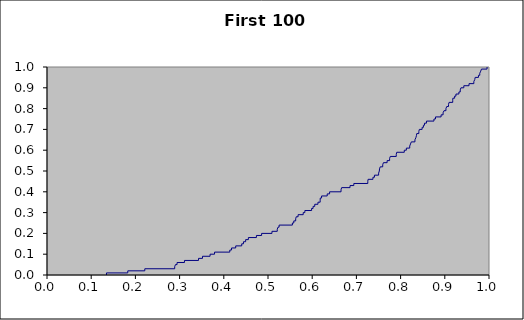
| Category | Series 0 |
|---|---|
| 0.13455305386940608 | 0 |
| 0.13455305386940608 | 0.01 |
| 0.18276183317802958 | 0.01 |
| 0.18276183317802958 | 0.02 |
| 0.22124137839260483 | 0.02 |
| 0.22124137839260483 | 0.03 |
| 0.2889093945239742 | 0.03 |
| 0.2889093945239742 | 0.04 |
| 0.29066765360203234 | 0.04 |
| 0.29066765360203234 | 0.05 |
| 0.29422580143166954 | 0.05 |
| 0.29422580143166954 | 0.06 |
| 0.3109875620651161 | 0.06 |
| 0.3109875620651161 | 0.07 |
| 0.34282517261200224 | 0.07 |
| 0.34282517261200224 | 0.08 |
| 0.3517873820542869 | 0.08 |
| 0.3517873820542869 | 0.09 |
| 0.3689463281720448 | 0.09 |
| 0.3689463281720448 | 0.1 |
| 0.3790477668345028 | 0.1 |
| 0.3790477668345028 | 0.11 |
| 0.41357675492989415 | 0.11 |
| 0.41357675492989415 | 0.12 |
| 0.417493631801864 | 0.12 |
| 0.417493631801864 | 0.13 |
| 0.4269480113402916 | 0.13 |
| 0.4269480113402916 | 0.14 |
| 0.44053109392780376 | 0.14 |
| 0.44053109392780376 | 0.15 |
| 0.4445297881575609 | 0.15 |
| 0.4445297881575609 | 0.16 |
| 0.44939216450777775 | 0.16 |
| 0.44939216450777775 | 0.17 |
| 0.4555851932242986 | 0.17 |
| 0.4555851932242986 | 0.18 |
| 0.47379882273148494 | 0.18 |
| 0.47379882273148494 | 0.19 |
| 0.4855100597031753 | 0.19 |
| 0.4855100597031753 | 0.2 |
| 0.5089497839653756 | 0.2 |
| 0.5089497839653756 | 0.21 |
| 0.5209627517010066 | 0.21 |
| 0.5209627517010066 | 0.22 |
| 0.5226923157140931 | 0.22 |
| 0.5226923157140931 | 0.23 |
| 0.5251040575780742 | 0.23 |
| 0.5251040575780742 | 0.24 |
| 0.5551500112860211 | 0.24 |
| 0.5551500112860211 | 0.25 |
| 0.5583286015876231 | 0.25 |
| 0.5583286015876231 | 0.26 |
| 0.5626280067760266 | 0.26 |
| 0.5626280067760266 | 0.27 |
| 0.5638732604246404 | 0.27 |
| 0.5638732604246404 | 0.28 |
| 0.5680648654399378 | 0.28 |
| 0.5680648654399378 | 0.29 |
| 0.5796776962765396 | 0.29 |
| 0.5796776962765396 | 0.3 |
| 0.5833835432091734 | 0.3 |
| 0.5833835432091734 | 0.31 |
| 0.5986512667009289 | 0.31 |
| 0.5986512667009289 | 0.32 |
| 0.6020101268498207 | 0.32 |
| 0.6020101268498207 | 0.33 |
| 0.6057763103128806 | 0.33 |
| 0.6057763103128806 | 0.34 |
| 0.6129847978524068 | 0.34 |
| 0.6129847978524068 | 0.35 |
| 0.6180251090993006 | 0.35 |
| 0.6180251090993006 | 0.36 |
| 0.6182573211400452 | 0.36 |
| 0.6182573211400452 | 0.37 |
| 0.6212044414760152 | 0.37 |
| 0.6212044414760152 | 0.38 |
| 0.6339704736572748 | 0.38 |
| 0.6339704736572748 | 0.39 |
| 0.639362838360495 | 0.39 |
| 0.639362838360495 | 0.4 |
| 0.6652625014112356 | 0.4 |
| 0.6652625014112356 | 0.41 |
| 0.6666106008838641 | 0.41 |
| 0.6666106008838641 | 0.42 |
| 0.6855616080756904 | 0.42 |
| 0.6855616080756904 | 0.43 |
| 0.6941687461939142 | 0.43 |
| 0.6941687461939142 | 0.44 |
| 0.7257639014780729 | 0.44 |
| 0.7257639014780729 | 0.45 |
| 0.7264253804586218 | 0.45 |
| 0.7264253804586218 | 0.46 |
| 0.7374461408638304 | 0.46 |
| 0.7374461408638304 | 0.47 |
| 0.7408600242821723 | 0.47 |
| 0.7408600242821723 | 0.48 |
| 0.7502604141916246 | 0.48 |
| 0.7502604141916246 | 0.49 |
| 0.7518715577794326 | 0.49 |
| 0.7518715577794326 | 0.5 |
| 0.7523297901009789 | 0.5 |
| 0.7523297901009789 | 0.51 |
| 0.7538860990464556 | 0.51 |
| 0.7538860990464556 | 0.52 |
| 0.7595407718475183 | 0.52 |
| 0.7595407718475183 | 0.53 |
| 0.7611422608573828 | 0.53 |
| 0.7611422608573828 | 0.54 |
| 0.7694822541234644 | 0.54 |
| 0.7694822541234644 | 0.55 |
| 0.7751330488475033 | 0.55 |
| 0.7751330488475033 | 0.56 |
| 0.7766462401101253 | 0.56 |
| 0.7766462401101253 | 0.57 |
| 0.7901772275603912 | 0.57 |
| 0.7901772275603912 | 0.58 |
| 0.7912846154829163 | 0.58 |
| 0.7912846154829163 | 0.59 |
| 0.8083528484278573 | 0.59 |
| 0.8083528484278573 | 0.6 |
| 0.8130650416595592 | 0.6 |
| 0.8130650416595592 | 0.61 |
| 0.8206241466640288 | 0.61 |
| 0.8206241466640288 | 0.62 |
| 0.8223900363704881 | 0.62 |
| 0.8223900363704881 | 0.63 |
| 0.8242858136484837 | 0.63 |
| 0.8242858136484837 | 0.64 |
| 0.8324097034456521 | 0.64 |
| 0.8324097034456521 | 0.65 |
| 0.8345467092771438 | 0.65 |
| 0.8345467092771438 | 0.66 |
| 0.8358142915470234 | 0.66 |
| 0.8358142915470234 | 0.67 |
| 0.8365581017247976 | 0.67 |
| 0.8365581017247976 | 0.68 |
| 0.8412481949805983 | 0.68 |
| 0.8412481949805983 | 0.69 |
| 0.8424181402431646 | 0.69 |
| 0.8424181402431646 | 0.7 |
| 0.8486969115973722 | 0.7 |
| 0.8486969115973722 | 0.71 |
| 0.8516625308197437 | 0.71 |
| 0.8516625308197437 | 0.72 |
| 0.8540659785649526 | 0.72 |
| 0.8540659785649526 | 0.73 |
| 0.8585389932581374 | 0.73 |
| 0.8585389932581374 | 0.74 |
| 0.8754295625026918 | 0.74 |
| 0.8754295625026918 | 0.75 |
| 0.8789527615539244 | 0.75 |
| 0.8789527615539244 | 0.76 |
| 0.8916106857938936 | 0.76 |
| 0.8916106857938936 | 0.77 |
| 0.8961166380914222 | 0.77 |
| 0.8961166380914222 | 0.78 |
| 0.8982400624029053 | 0.78 |
| 0.8982400624029053 | 0.79 |
| 0.9025793706840394 | 0.79 |
| 0.9025793706840394 | 0.8 |
| 0.9043851204081507 | 0.8 |
| 0.9043851204081507 | 0.81 |
| 0.9083978631796679 | 0.81 |
| 0.9083978631796679 | 0.82 |
| 0.9096458951040006 | 0.82 |
| 0.9096458951040006 | 0.83 |
| 0.9179266062903838 | 0.83 |
| 0.9179266062903838 | 0.84 |
| 0.9182228595021318 | 0.84 |
| 0.9182228595021318 | 0.85 |
| 0.9222637868510184 | 0.85 |
| 0.9222637868510184 | 0.86 |
| 0.9252117909185877 | 0.86 |
| 0.9252117909185877 | 0.87 |
| 0.9318876387736391 | 0.87 |
| 0.9318876387736391 | 0.88 |
| 0.9349417550124406 | 0.88 |
| 0.9349417550124406 | 0.89 |
| 0.9364978180899991 | 0.89 |
| 0.9364978180899991 | 0.9 |
| 0.9430230700013641 | 0.9 |
| 0.9430230700013641 | 0.91 |
| 0.9548197958900058 | 0.91 |
| 0.9548197958900058 | 0.92 |
| 0.965690135846264 | 0.92 |
| 0.965690135846264 | 0.93 |
| 0.967859064375943 | 0.93 |
| 0.967859064375943 | 0.94 |
| 0.9686831393537327 | 0.94 |
| 0.9686831393537327 | 0.95 |
| 0.9761548636599043 | 0.95 |
| 0.9761548636599043 | 0.96 |
| 0.9790752105410397 | 0.96 |
| 0.9790752105410397 | 0.97 |
| 0.9812980990648462 | 0.97 |
| 0.9812980990648462 | 0.98 |
| 0.9829846923334751 | 0.98 |
| 0.9829846923334751 | 0.99 |
| 0.9955931044612027 | 0.99 |
| 0.9955931044612027 | 1 |